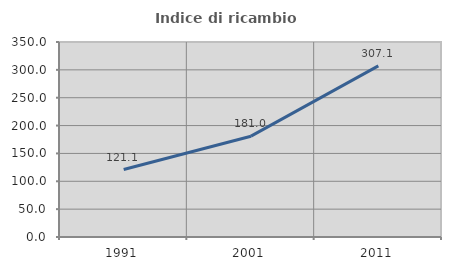
| Category | Indice di ricambio occupazionale  |
|---|---|
| 1991.0 | 121.053 |
| 2001.0 | 180.952 |
| 2011.0 | 307.143 |